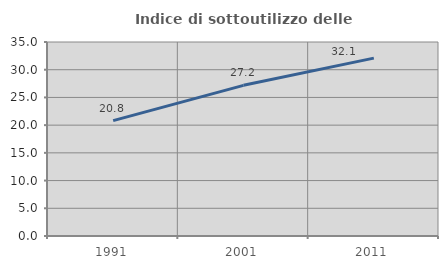
| Category | Indice di sottoutilizzo delle abitazioni  |
|---|---|
| 1991.0 | 20.822 |
| 2001.0 | 27.184 |
| 2011.0 | 32.089 |